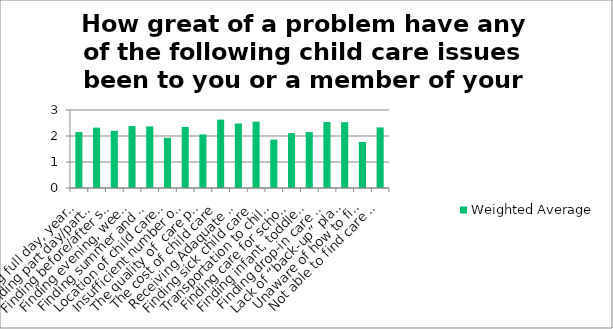
| Category | Weighted Average |
|---|---|
| Finding full day, year-round child care | 2.15 |
| Finding part day/part week child care | 2.32 |
| Finding before/after school care | 2.2 |
| Finding evening, weekend, or overnight child care (while parents work) | 2.38 |
| Finding summer and holiday child care (while parents work) | 2.37 |
| Location of child care facilities | 1.93 |
| Insufficient number of registered, licensed child care facilities | 2.35 |
| The quality of  care provided at the facilities | 2.06 |
| The cost of child care | 2.63 |
| Receiving Adaquate Government-Funded Childcare Assistance | 2.48 |
| Finding sick child care | 2.55 |
| Transportation to child care facility | 1.86 |
| Finding care for school age children | 2.11 |
| Finding infant, toddler or preschool care | 2.15 |
| Finding drop-in care or last minute care | 2.54 |
| Lack of “back-up” plan when child care provider is not available | 2.53 |
| Unaware of how to find child care facilities | 1.77 |
| Not able to find care for a special needs child | 2.33 |